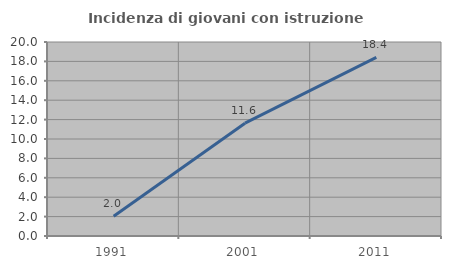
| Category | Incidenza di giovani con istruzione universitaria |
|---|---|
| 1991.0 | 2.041 |
| 2001.0 | 11.628 |
| 2011.0 | 18.421 |